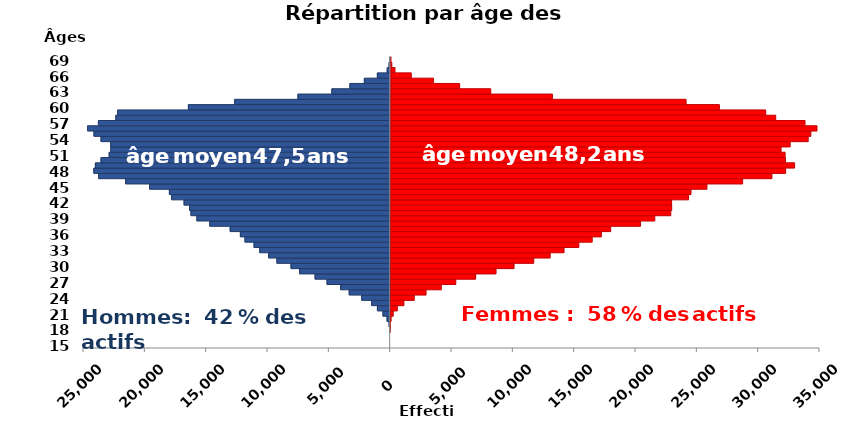
| Category | age | Homme | Femme |
|---|---|---|---|
| 15.0 | 15 | 0 | 0 |
| 16.0 | 16 | 0 | 0 |
| 17.0 | 17 | 0 | 0 |
| 18.0 | 18 | -10 | 3 |
| 19.0 | 19 | -86 | 18 |
| 20.0 | 20 | -252 | 96 |
| 21.0 | 21 | -584 | 268 |
| 22.0 | 22 | -1039 | 600 |
| 23.0 | 23 | -1509 | 1139 |
| 24.0 | 24 | -2317 | 1978 |
| 25.0 | 25 | -3338 | 2940 |
| 26.0 | 26 | -4040 | 4183 |
| 27.0 | 27 | -5146 | 5362 |
| 28.0 | 28 | -6119 | 6982 |
| 29.0 | 29 | -7383 | 8643 |
| 30.0 | 30 | -8083 | 10112 |
| 31.0 | 31 | -9235 | 11714 |
| 32.0 | 32 | -9912 | 13052 |
| 33.0 | 33 | -10632 | 14183 |
| 34.0 | 34 | -11096 | 15389 |
| 35.0 | 35 | -11835 | 16475 |
| 36.0 | 36 | -12211 | 17224 |
| 37.0 | 37 | -13041 | 17982 |
| 38.0 | 38 | -14706 | 20408 |
| 39.0 | 39 | -15755 | 21577 |
| 40.0 | 40 | -16237 | 22877 |
| 41.0 | 41 | -16355 | 22950 |
| 42.0 | 42 | -16800 | 22940 |
| 43.0 | 43 | -17816 | 24320 |
| 44.0 | 44 | -17998 | 24522 |
| 45.0 | 45 | -19610 | 25820 |
| 46.0 | 46 | -21566 | 28728 |
| 47.0 | 47 | -23775 | 31115 |
| 48.0 | 48 | -24156 | 32233 |
| 49.0 | 49 | -24030 | 32962 |
| 50.0 | 50 | -23572 | 32213 |
| 51.0 | 51 | -22906 | 32186 |
| 52.0 | 52 | -22772 | 31855 |
| 53.0 | 53 | -22780 | 32595 |
| 54.0 | 54 | -23570 | 34064 |
| 55.0 | 55 | -24145 | 34282 |
| 56.0 | 56 | -24664 | 34779 |
| 57.0 | 57 | -23784 | 33804 |
| 58.0 | 58 | -22365 | 31414 |
| 59.0 | 59 | -22217 | 30597 |
| 60.0 | 60 | -16449 | 26820 |
| 61.0 | 61 | -12678 | 24103 |
| 62.0 | 62 | -7518 | 13206 |
| 63.0 | 63 | -4754 | 8178 |
| 64.0 | 64 | -3281 | 5636 |
| 65.0 | 65 | -2105 | 3513 |
| 66.0 | 66 | -1044 | 1698 |
| 67.0 | 67 | -241 | 367 |
| 68.0 | 68 | -86 | 109 |
| 69.0 | 69 | -38 | 34 |